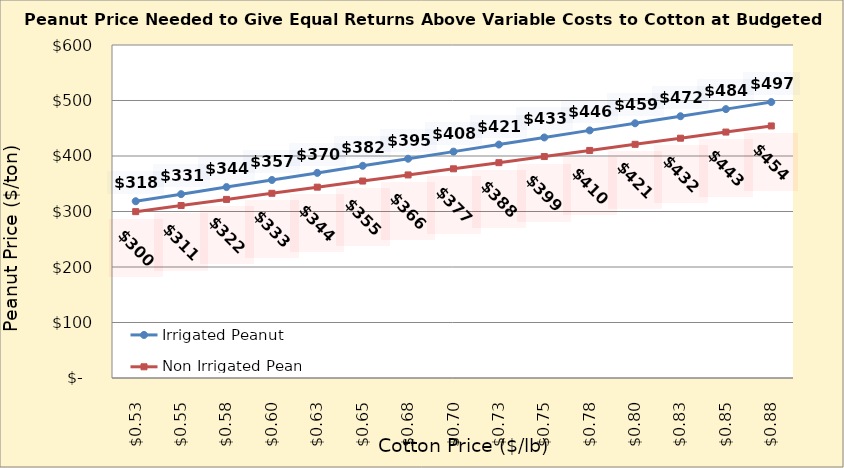
| Category | Irrigated Peanut | Non Irrigated Peanut |
|---|---|---|
| 0.5249999999999998 | 318.497 | 299.728 |
| 0.5499999999999998 | 331.263 | 310.757 |
| 0.5749999999999998 | 344.028 | 321.787 |
| 0.5999999999999999 | 356.794 | 332.816 |
| 0.6249999999999999 | 369.56 | 343.846 |
| 0.6499999999999999 | 382.326 | 354.875 |
| 0.6749999999999999 | 395.092 | 365.905 |
| 0.7 | 407.858 | 376.934 |
| 0.725 | 420.624 | 387.963 |
| 0.75 | 433.39 | 398.993 |
| 0.775 | 446.156 | 410.022 |
| 0.8 | 458.922 | 421.052 |
| 0.8250000000000001 | 471.688 | 432.081 |
| 0.8500000000000001 | 484.454 | 443.11 |
| 0.8750000000000001 | 497.22 | 454.14 |